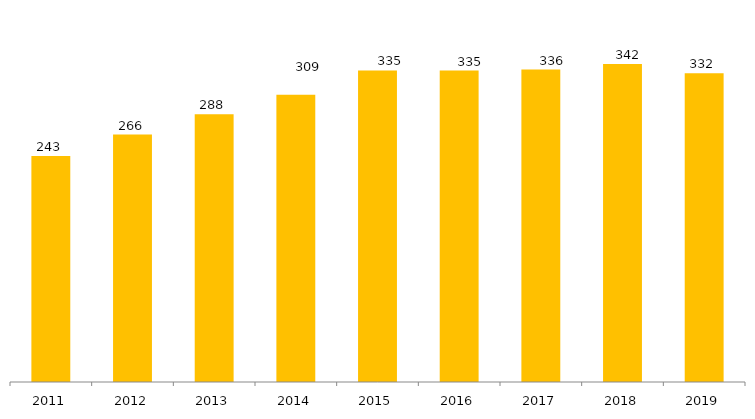
| Category | Categoria/Ano |
|---|---|
| 2011.0 | 243 |
| 2012.0 | 266 |
| 2013.0 | 288 |
| 2014.0 | 309 |
| 2015.0 | 335 |
| 2016.0 | 335 |
| 2017.0 | 336 |
| 2018.0 | 342 |
| 2019.0 | 332 |